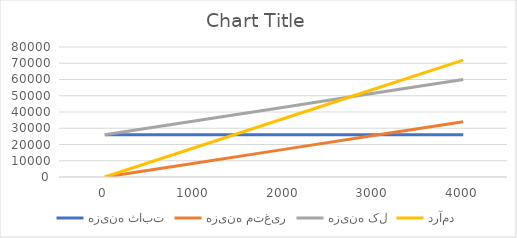
| Category | هزینه ثابت | هزینه متغیر | هزینه کل | درآمد |
|---|---|---|---|---|
| 0.0 | 25984 | 0 | 25984 | 0 |
| 1000.0 | 25984 | 8500 | 34484 | 17990 |
| 2000.0 | 25984 | 17000 | 42984 | 35980 |
| 3000.0 | 25984 | 25500 | 51484 | 53970 |
| 4000.0 | 25984 | 34000 | 59984 | 71960 |